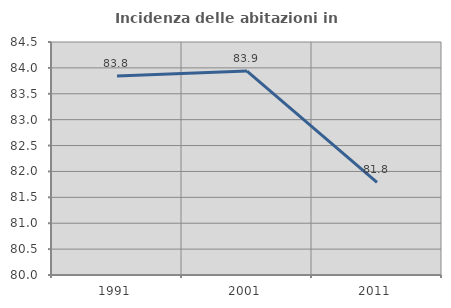
| Category | Incidenza delle abitazioni in proprietà  |
|---|---|
| 1991.0 | 83.841 |
| 2001.0 | 83.939 |
| 2011.0 | 81.79 |